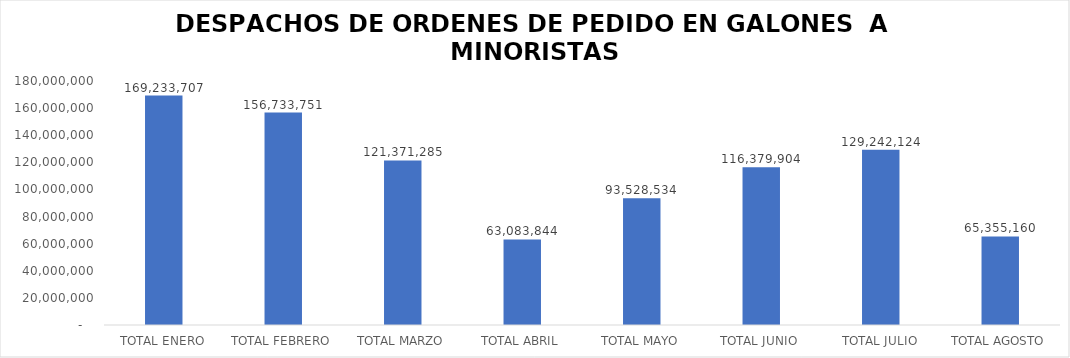
| Category | Series 0 |
|---|---|
| TOTAL ENERO | 169233707.47 |
| TOTAL FEBRERO | 156733751 |
| TOTAL MARZO | 121371285.11 |
| TOTAL ABRIL | 63083844 |
| TOTAL MAYO | 93528534 |
| TOTAL JUNIO | 116379904.02 |
| TOTAL JULIO | 129242124 |
| TOTAL AGOSTO | 65355160.43 |